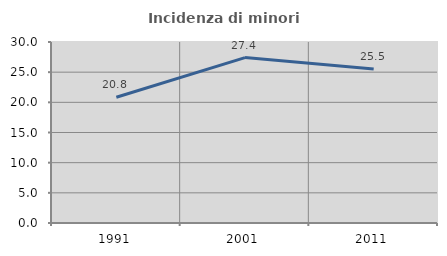
| Category | Incidenza di minori stranieri |
|---|---|
| 1991.0 | 20.833 |
| 2001.0 | 27.419 |
| 2011.0 | 25.509 |